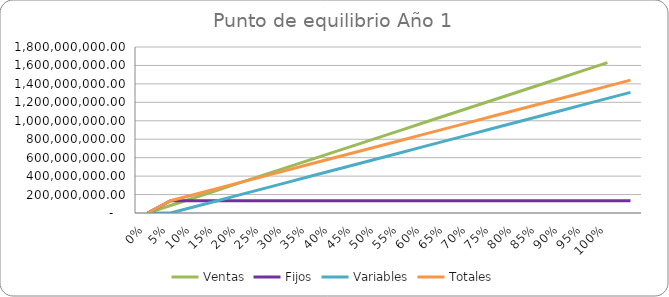
| Category | Ventas | Fijos | Variables | Totales |
|---|---|---|---|---|
| 0.0 | 0 | 0 | 0 | 0 |
| 0.05 | 81506250 | 132722580.987 | 0 | 132722580.987 |
| 0.1 | 163012500 | 132722580.987 | 65409201.097 | 198131782.084 |
| 0.15 | 244518750 | 132722580.987 | 130818402.194 | 263540983.181 |
| 0.2 | 326025000 | 132722580.987 | 196227603.291 | 328950184.278 |
| 0.25 | 407531250 | 132722580.987 | 261636804.389 | 394359385.375 |
| 0.3 | 489037500 | 132722580.987 | 327046005.486 | 459768586.472 |
| 0.35 | 570543750 | 132722580.987 | 392455206.583 | 525177787.569 |
| 0.4 | 652050000 | 132722580.987 | 457864407.68 | 590586988.667 |
| 0.45 | 733556250 | 132722580.987 | 523273608.777 | 655996189.764 |
| 0.5 | 815062500 | 132722580.987 | 588682809.874 | 721405390.861 |
| 0.55 | 896568750 | 132722580.987 | 654092010.971 | 786814591.958 |
| 0.6 | 978075000 | 132722580.987 | 719501212.069 | 852223793.055 |
| 0.65 | 1059581250 | 132722580.987 | 784910413.166 | 917632994.152 |
| 0.7 | 1141087500 | 132722580.987 | 850319614.263 | 983042195.249 |
| 0.75 | 1222593750 | 132722580.987 | 915728815.36 | 1048451396.347 |
| 0.8 | 1304100000 | 132722580.987 | 981138016.457 | 1113860597.444 |
| 0.85 | 1385606250 | 132722580.987 | 1046547217.554 | 1179269798.541 |
| 0.9 | 1467112500 | 132722580.987 | 1111956418.651 | 1244678999.638 |
| 0.95 | 1548618750 | 132722580.987 | 1177365619.749 | 1310088200.735 |
| 1.0 | 1630125000 | 132722580.987 | 1242774820.846 | 1375497401.832 |